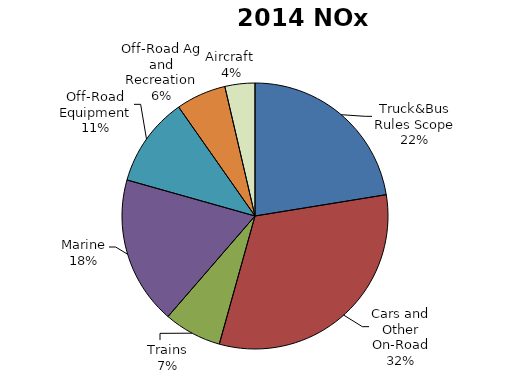
| Category | Series 0 |
|---|---|
| Truck&Bus Rules Scope | 346.462 |
| Cars and Other On-Road | 492.449 |
| Trains | 108.476 |
| Marine | 278.131 |
| Off-Road Equipment | 168.391 |
| Off-Road Ag and Recreation | 93.97 |
| Aircraft  | 56.282 |